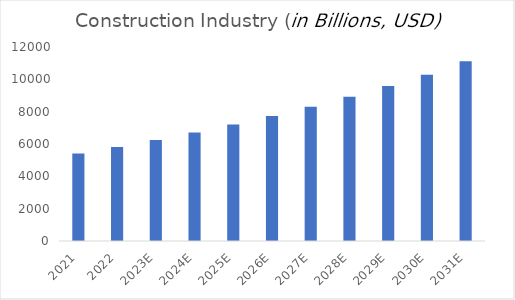
| Category | Series 0 |
|---|---|
| 2021 | 5412.8 |
| 2022 | 5813.347 |
| 2023E | 6243.535 |
| 2024E | 6705.556 |
| 2025E | 7201.768 |
| 2026E | 7734.698 |
| 2027E | 8307.066 |
| 2028E | 8921.789 |
| 2029E | 9582.001 |
| 2030E | 10291.07 |
| 2031E | 11121.9 |